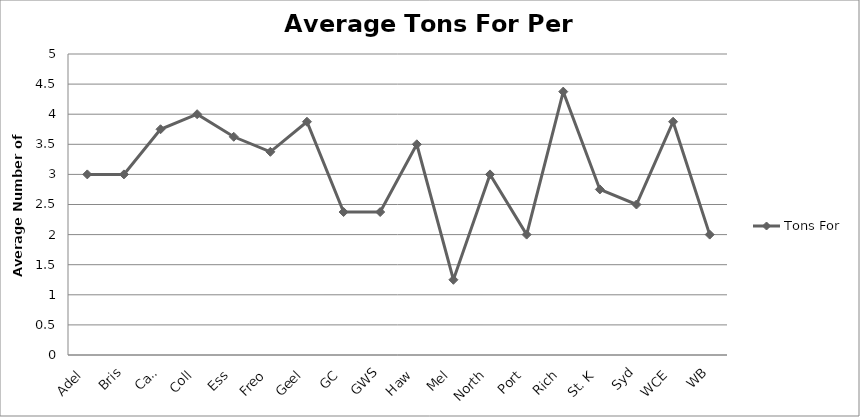
| Category | Tons For |
|---|---|
| Adel | 3 |
| Bris | 3 |
| Carl | 3.75 |
| Coll | 4 |
| Ess | 3.625 |
| Freo | 3.375 |
| Geel | 3.875 |
| GC | 2.375 |
| GWS | 2.375 |
| Haw | 3.5 |
| Mel | 1.25 |
| North | 3 |
| Port | 2 |
| Rich | 4.375 |
| St. K | 2.75 |
| Syd | 2.5 |
| WCE | 3.875 |
| WB | 2 |